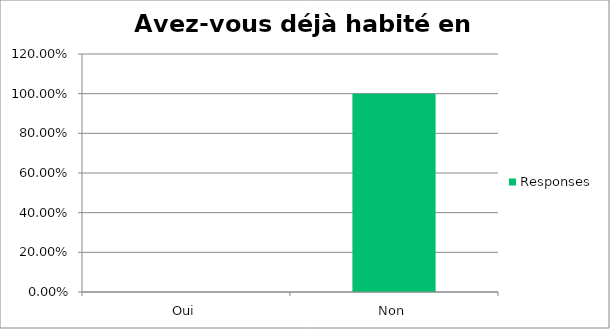
| Category | Responses |
|---|---|
| Oui | 0 |
| Non | 1 |